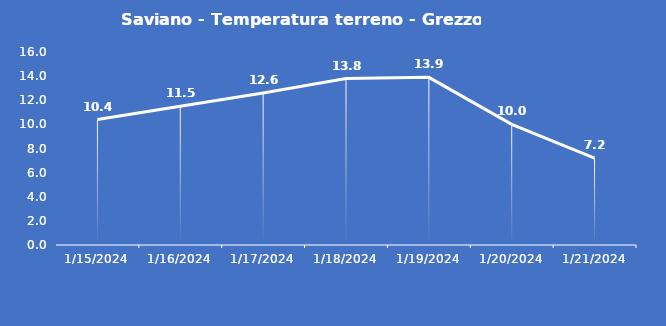
| Category | Saviano - Temperatura terreno - Grezzo (°C) |
|---|---|
| 1/15/24 | 10.4 |
| 1/16/24 | 11.5 |
| 1/17/24 | 12.6 |
| 1/18/24 | 13.8 |
| 1/19/24 | 13.9 |
| 1/20/24 | 10 |
| 1/21/24 | 7.2 |